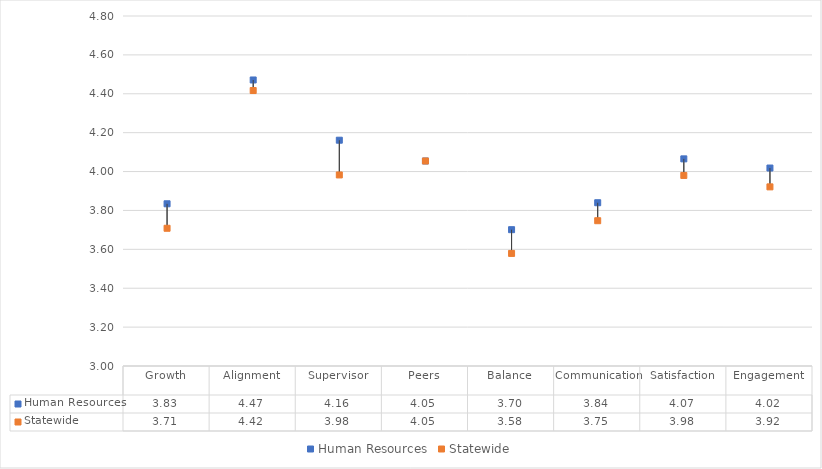
| Category | Human Resources | Statewide |
|---|---|---|
| Growth | 3.834 | 3.708 |
| Alignment | 4.471 | 4.417 |
| Supervisor | 4.161 | 3.983 |
| Peers | 4.054 | 4.054 |
| Balance | 3.701 | 3.579 |
| Communication | 3.84 | 3.747 |
| Satisfaction | 4.065 | 3.98 |
| Engagement | 4.018 | 3.921 |